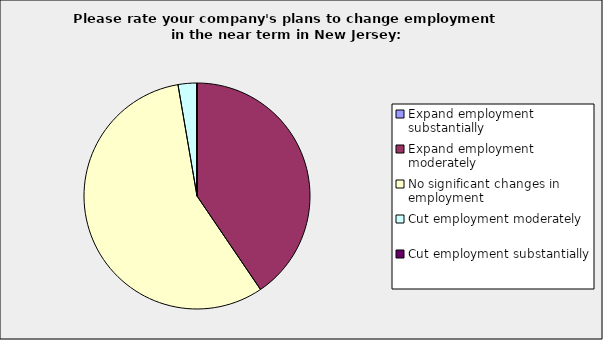
| Category | Series 0 |
|---|---|
| Expand employment substantially | 0 |
| Expand employment moderately | 0.405 |
| No significant changes in employment | 0.568 |
| Cut employment moderately | 0.027 |
| Cut employment substantially | 0 |